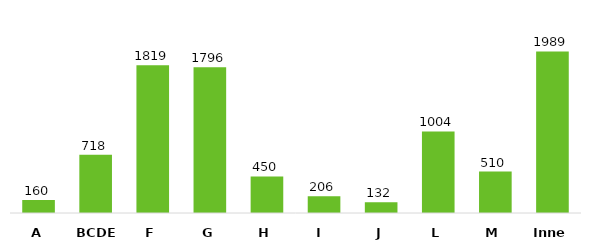
| Category | Series 0 |
|---|---|
| A | 160 |
| BCDE | 718 |
| F | 1819 |
| G | 1796 |
| H | 450 |
| I  | 206 |
| J | 132 |
| L | 1004 |
| M | 510 |
| Inne | 1989 |